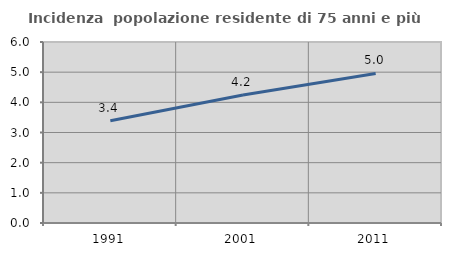
| Category | Incidenza  popolazione residente di 75 anni e più |
|---|---|
| 1991.0 | 3.391 |
| 2001.0 | 4.245 |
| 2011.0 | 4.958 |